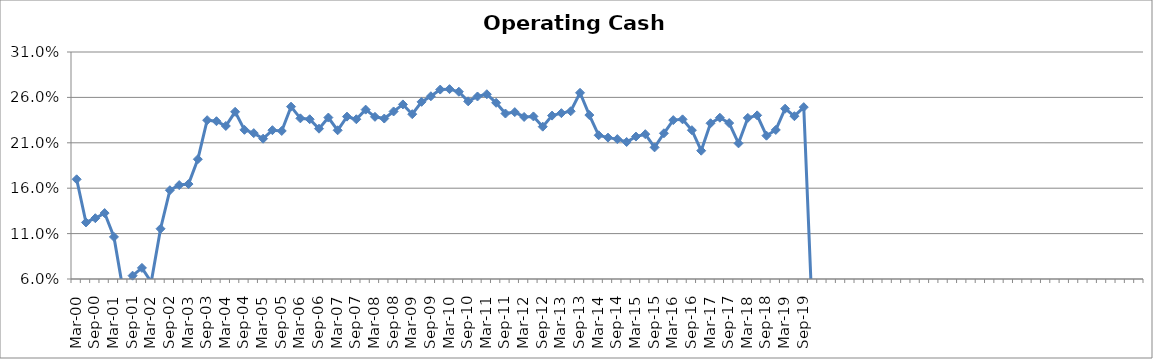
| Category | Operating Cash Margin |
|---|---|
| Mar-00 | 0.17 |
| Jun-00 | 0.122 |
| Sep-00 | 0.127 |
| Dec-00 | 0.133 |
| Mar-01 | 0.106 |
| Jun-01 | 0.046 |
| Sep-01 | 0.064 |
| Dec-01 | 0.072 |
| Mar-02 | 0.057 |
| Jun-02 | 0.115 |
| Sep-02 | 0.158 |
| Dec-02 | 0.163 |
| Mar-03 | 0.165 |
| Jun-03 | 0.192 |
| Sep-03 | 0.235 |
| Dec-03 | 0.234 |
| Mar-04 | 0.229 |
| Jun-04 | 0.244 |
| Sep-04 | 0.224 |
| Dec-04 | 0.221 |
| Mar-05 | 0.215 |
| Jun-05 | 0.224 |
| Sep-05 | 0.223 |
| Dec-05 | 0.25 |
| Mar-06 | 0.237 |
| Jun-06 | 0.236 |
| Sep-06 | 0.226 |
| Dec-06 | 0.238 |
| Mar-07 | 0.224 |
| Jun-07 | 0.239 |
| Sep-07 | 0.236 |
| Dec-07 | 0.247 |
| Mar-08 | 0.239 |
| Jun-08 | 0.237 |
| Sep-08 | 0.245 |
| Dec-08 | 0.252 |
| Mar-09 | 0.242 |
| Jun-09 | 0.255 |
| Sep-09 | 0.261 |
| Dec-09 | 0.269 |
| Mar-10 | 0.269 |
| Jun-10 | 0.266 |
| Sep-10 | 0.256 |
| Dec-10 | 0.261 |
| Mar-11 | 0.263 |
| Jun-11 | 0.254 |
| Sep-11 | 0.242 |
| Dec-11 | 0.244 |
| Mar-12 | 0.238 |
| Jun-12 | 0.239 |
| Sep-12 | 0.228 |
| Dec-12 | 0.24 |
| Mar-13 | 0.243 |
| Jun-13 | 0.245 |
| Sep-13 | 0.265 |
| Dec-13 | 0.241 |
| Mar-14 | 0.218 |
| Jun-14 | 0.216 |
| Sep-14 | 0.214 |
| Dec-14 | 0.211 |
| Mar-15 | 0.217 |
| Jun-15 | 0.219 |
| Sep-15 | 0.205 |
| Dec-15 | 0.22 |
| Mar-16 | 0.235 |
| Jun-16 | 0.236 |
| Sep-16 | 0.224 |
| Dec-16 | 0.201 |
| Mar-17 | 0.232 |
| Jun-17 | 0.238 |
| Sep-17 | 0.232 |
| Dec-17 | 0.209 |
| Mar-18 | 0.237 |
| Jun-18 | 0.24 |
| Sep-18 | 0.218 |
| Dec-18 | 0.224 |
| Mar-19 | 0.248 |
| Jun-19 | 0.239 |
| Sep-19 | 0.249 |